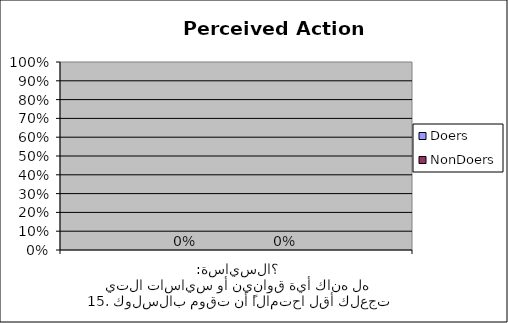
| Category | Doers | NonDoers |
|---|---|---|
| 15. السياسة: هل هناك أية قوانين أو سياسات التي تجعلك أقل احتمالاً أن تقوم بالسلوك؟  | 0 | 0 |